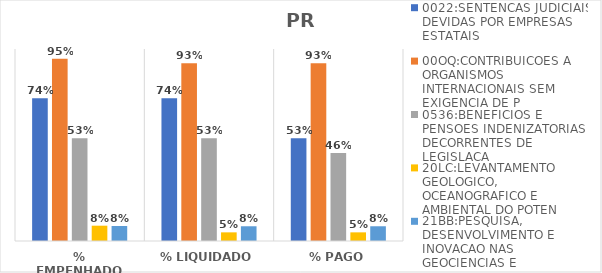
| Category | 0022:SENTENCAS JUDICIAIS DEVIDAS POR EMPRESAS ESTATAIS | 00OQ:CONTRIBUICOES A ORGANISMOS INTERNACIONAIS SEM EXIGENCIA DE P | 0536:BENEFICIOS E PENSOES INDENIZATORIAS DECORRENTES DE LEGISLACA | 20LC:LEVANTAMENTO GEOLOGICO, OCEANOGRAFICO E AMBIENTAL DO POTEN | 21BB:PESQUISA, DESENVOLVIMENTO E INOVACAO NAS GEOCIENCIAS E |
|---|---|---|---|---|---|
| % EMPENHADO | 0.744 | 0.95 | 0.535 | 0.08 | 0.078 |
| % LIQUIDADO | 0.744 | 0.926 | 0.535 | 0.045 | 0.077 |
| % PAGO | 0.535 | 0.926 | 0.459 | 0.045 | 0.077 |